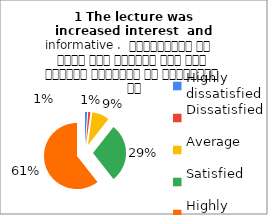
| Category | 1 The lecture was
increased interest  and informative .  व्याख्यान से रुचि में वृद्धि हुई एवं शिक्षण जानकारी से परिपूर्ण था |
|---|---|
| Highly dissatisfied | 1 |
| Dissatisfied | 1 |
| Average | 8 |
| Satisfied | 27 |
| Highly satisfied | 57 |